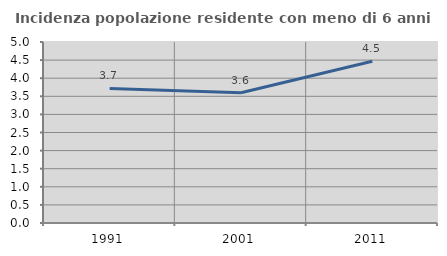
| Category | Incidenza popolazione residente con meno di 6 anni |
|---|---|
| 1991.0 | 3.717 |
| 2001.0 | 3.599 |
| 2011.0 | 4.47 |